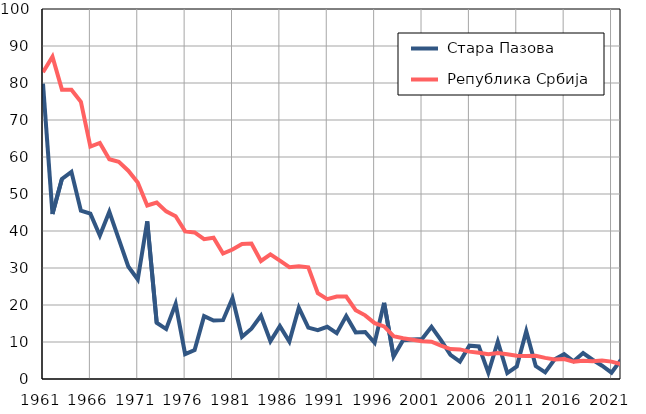
| Category |  Стара Пазова |  Република Србија |
|---|---|---|
| 1961.0 | 79.8 | 82.9 |
| 1962.0 | 44.6 | 87.1 |
| 1963.0 | 54.1 | 78.2 |
| 1964.0 | 56 | 78.2 |
| 1965.0 | 45.5 | 74.9 |
| 1966.0 | 44.7 | 62.8 |
| 1967.0 | 38.8 | 63.8 |
| 1968.0 | 45.2 | 59.4 |
| 1969.0 | 37.8 | 58.7 |
| 1970.0 | 30.4 | 56.3 |
| 1971.0 | 26.9 | 53.1 |
| 1972.0 | 42.6 | 46.9 |
| 1973.0 | 15.2 | 47.7 |
| 1974.0 | 13.5 | 45.3 |
| 1975.0 | 20.3 | 44 |
| 1976.0 | 6.7 | 39.9 |
| 1977.0 | 7.8 | 39.6 |
| 1978.0 | 17 | 37.8 |
| 1979.0 | 15.8 | 38.2 |
| 1980.0 | 15.9 | 33.9 |
| 1981.0 | 21.9 | 35 |
| 1982.0 | 11.4 | 36.5 |
| 1983.0 | 13.6 | 36.6 |
| 1984.0 | 17.1 | 31.9 |
| 1985.0 | 10.2 | 33.7 |
| 1986.0 | 14.3 | 32 |
| 1987.0 | 10.1 | 30.2 |
| 1988.0 | 19.3 | 30.5 |
| 1989.0 | 13.9 | 30.2 |
| 1990.0 | 13.2 | 23.2 |
| 1991.0 | 14.1 | 21.6 |
| 1992.0 | 12.4 | 22.3 |
| 1993.0 | 17 | 22.3 |
| 1994.0 | 12.6 | 18.6 |
| 1995.0 | 12.7 | 17.2 |
| 1996.0 | 9.8 | 15.1 |
| 1997.0 | 20.6 | 14.2 |
| 1998.0 | 6.1 | 11.6 |
| 1999.0 | 10.5 | 11 |
| 2000.0 | 10.7 | 10.6 |
| 2001.0 | 10.8 | 10.2 |
| 2002.0 | 14.1 | 10.1 |
| 2003.0 | 10.5 | 9 |
| 2004.0 | 6.5 | 8.1 |
| 2005.0 | 4.7 | 8 |
| 2006.0 | 9 | 7.4 |
| 2007.0 | 8.8 | 7.1 |
| 2008.0 | 1.7 | 6.7 |
| 2009.0 | 10.1 | 7 |
| 2010.0 | 1.6 | 6.7 |
| 2011.0 | 3.4 | 6.3 |
| 2012.0 | 12.9 | 6.2 |
| 2013.0 | 3.5 | 6.3 |
| 2014.0 | 1.8 | 5.7 |
| 2015.0 | 5.3 | 5.3 |
| 2016.0 | 6.7 | 5.4 |
| 2017.0 | 4.8 | 4.7 |
| 2018.0 | 7 | 4.9 |
| 2019.0 | 5.2 | 4.8 |
| 2020.0 | 3.6 | 5 |
| 2021.0 | 1.7 | 4.7 |
| 2022.0 | 5.2 | 4 |